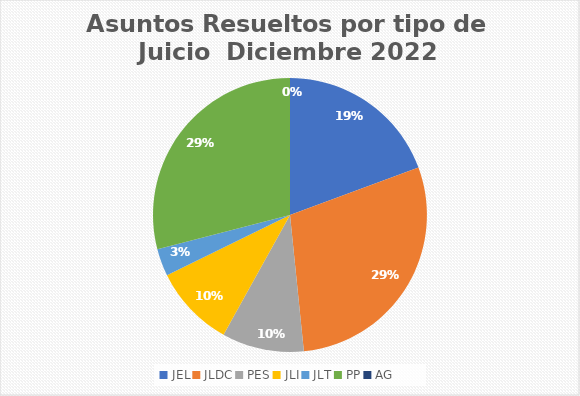
| Category | Asuntos Resueltos por tipo de Juicio  Diciembre |
|---|---|
| JEL | 6 |
| JLDC | 9 |
| PES | 3 |
| JLI | 3 |
| JLT | 1 |
| PP | 9 |
| AG | 0 |